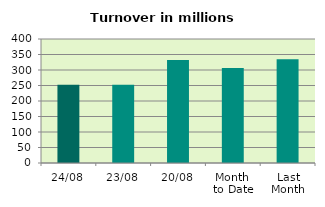
| Category | Series 0 |
|---|---|
| 24/08 | 252.708 |
| 23/08 | 252.131 |
| 20/08 | 332.656 |
| Month 
to Date | 306.818 |
| Last
Month | 334.97 |